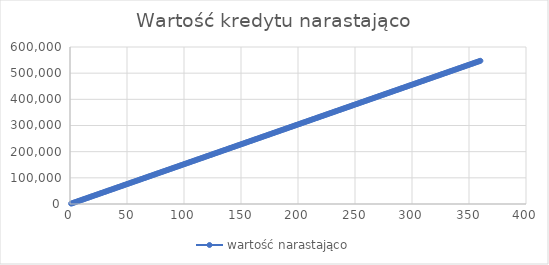
| Category | wartość narastająco |
|---|---|
| 1.0 | 1520.056 |
| 2.0 | 3040.112 |
| 3.0 | 4560.168 |
| 4.0 | 6080.224 |
| 5.0 | 7600.28 |
| 6.0 | 9120.336 |
| 7.0 | 10640.392 |
| 8.0 | 12160.447 |
| 9.0 | 13680.503 |
| 10.0 | 15200.559 |
| 11.0 | 16720.615 |
| 12.0 | 18240.671 |
| 13.0 | 19760.727 |
| 14.0 | 21280.783 |
| 15.0 | 22800.839 |
| 16.0 | 24320.895 |
| 17.0 | 25840.951 |
| 18.0 | 27361.007 |
| 19.0 | 28881.063 |
| 20.0 | 30401.119 |
| 21.0 | 31921.175 |
| 22.0 | 33441.23 |
| 23.0 | 34961.286 |
| 24.0 | 36481.342 |
| 25.0 | 38001.398 |
| 26.0 | 39521.454 |
| 27.0 | 41041.51 |
| 28.0 | 42561.566 |
| 29.0 | 44081.622 |
| 30.0 | 45601.678 |
| 31.0 | 47121.734 |
| 32.0 | 48641.79 |
| 33.0 | 50161.846 |
| 34.0 | 51681.902 |
| 35.0 | 53201.958 |
| 36.0 | 54722.013 |
| 37.0 | 56242.069 |
| 38.0 | 57762.125 |
| 39.0 | 59282.181 |
| 40.0 | 60802.237 |
| 41.0 | 62322.293 |
| 42.0 | 63842.349 |
| 43.0 | 65362.405 |
| 44.0 | 66882.461 |
| 45.0 | 68402.517 |
| 46.0 | 69922.573 |
| 47.0 | 71442.629 |
| 48.0 | 72962.685 |
| 49.0 | 74482.741 |
| 50.0 | 76002.796 |
| 51.0 | 77522.852 |
| 52.0 | 79042.908 |
| 53.0 | 80562.964 |
| 54.0 | 82083.02 |
| 55.0 | 83603.076 |
| 56.0 | 85123.132 |
| 57.0 | 86643.188 |
| 58.0 | 88163.244 |
| 59.0 | 89683.3 |
| 60.0 | 91203.356 |
| 61.0 | 92723.412 |
| 62.0 | 94243.468 |
| 63.0 | 95763.524 |
| 64.0 | 97283.579 |
| 65.0 | 98803.635 |
| 66.0 | 100323.691 |
| 67.0 | 101843.747 |
| 68.0 | 103363.803 |
| 69.0 | 104883.859 |
| 70.0 | 106403.915 |
| 71.0 | 107923.971 |
| 72.0 | 109444.027 |
| 73.0 | 110964.083 |
| 74.0 | 112484.139 |
| 75.0 | 114004.195 |
| 76.0 | 115524.251 |
| 77.0 | 117044.307 |
| 78.0 | 118564.362 |
| 79.0 | 120084.418 |
| 80.0 | 121604.474 |
| 81.0 | 123124.53 |
| 82.0 | 124644.586 |
| 83.0 | 126164.642 |
| 84.0 | 127684.698 |
| 85.0 | 129204.754 |
| 86.0 | 130724.81 |
| 87.0 | 132244.866 |
| 88.0 | 133764.922 |
| 89.0 | 135284.978 |
| 90.0 | 136805.034 |
| 91.0 | 138325.09 |
| 92.0 | 139845.146 |
| 93.0 | 141365.201 |
| 94.0 | 142885.257 |
| 95.0 | 144405.313 |
| 96.0 | 145925.369 |
| 97.0 | 147445.425 |
| 98.0 | 148965.481 |
| 99.0 | 150485.537 |
| 100.0 | 152005.593 |
| 101.0 | 153525.649 |
| 102.0 | 155045.705 |
| 103.0 | 156565.761 |
| 104.0 | 158085.817 |
| 105.0 | 159605.873 |
| 106.0 | 161125.929 |
| 107.0 | 162645.984 |
| 108.0 | 164166.04 |
| 109.0 | 165686.096 |
| 110.0 | 167206.152 |
| 111.0 | 168726.208 |
| 112.0 | 170246.264 |
| 113.0 | 171766.32 |
| 114.0 | 173286.376 |
| 115.0 | 174806.432 |
| 116.0 | 176326.488 |
| 117.0 | 177846.544 |
| 118.0 | 179366.6 |
| 119.0 | 180886.656 |
| 120.0 | 182406.712 |
| 121.0 | 183926.767 |
| 122.0 | 185446.823 |
| 123.0 | 186966.879 |
| 124.0 | 188486.935 |
| 125.0 | 190006.991 |
| 126.0 | 191527.047 |
| 127.0 | 193047.103 |
| 128.0 | 194567.159 |
| 129.0 | 196087.215 |
| 130.0 | 197607.271 |
| 131.0 | 199127.327 |
| 132.0 | 200647.383 |
| 133.0 | 202167.439 |
| 134.0 | 203687.495 |
| 135.0 | 205207.55 |
| 136.0 | 206727.606 |
| 137.0 | 208247.662 |
| 138.0 | 209767.718 |
| 139.0 | 211287.774 |
| 140.0 | 212807.83 |
| 141.0 | 214327.886 |
| 142.0 | 215847.942 |
| 143.0 | 217367.998 |
| 144.0 | 218888.054 |
| 145.0 | 220408.11 |
| 146.0 | 221928.166 |
| 147.0 | 223448.222 |
| 148.0 | 224968.278 |
| 149.0 | 226488.333 |
| 150.0 | 228008.389 |
| 151.0 | 229528.445 |
| 152.0 | 231048.501 |
| 153.0 | 232568.557 |
| 154.0 | 234088.613 |
| 155.0 | 235608.669 |
| 156.0 | 237128.725 |
| 157.0 | 238648.781 |
| 158.0 | 240168.837 |
| 159.0 | 241688.893 |
| 160.0 | 243208.949 |
| 161.0 | 244729.005 |
| 162.0 | 246249.061 |
| 163.0 | 247769.117 |
| 164.0 | 249289.172 |
| 165.0 | 250809.228 |
| 166.0 | 252329.284 |
| 167.0 | 253849.34 |
| 168.0 | 255369.396 |
| 169.0 | 256889.452 |
| 170.0 | 258409.508 |
| 171.0 | 259929.564 |
| 172.0 | 261449.62 |
| 173.0 | 262969.676 |
| 174.0 | 264489.732 |
| 175.0 | 266009.788 |
| 176.0 | 267529.844 |
| 177.0 | 269049.9 |
| 178.0 | 270569.955 |
| 179.0 | 272090.011 |
| 180.0 | 273610.067 |
| 181.0 | 275130.123 |
| 182.0 | 276650.179 |
| 183.0 | 278170.235 |
| 184.0 | 279690.291 |
| 185.0 | 281210.347 |
| 186.0 | 282730.403 |
| 187.0 | 284250.459 |
| 188.0 | 285770.515 |
| 189.0 | 287290.571 |
| 190.0 | 288810.627 |
| 191.0 | 290330.683 |
| 192.0 | 291850.738 |
| 193.0 | 293370.794 |
| 194.0 | 294890.85 |
| 195.0 | 296410.906 |
| 196.0 | 297930.962 |
| 197.0 | 299451.018 |
| 198.0 | 300971.074 |
| 199.0 | 302491.13 |
| 200.0 | 304011.186 |
| 201.0 | 305531.242 |
| 202.0 | 307051.298 |
| 203.0 | 308571.354 |
| 204.0 | 310091.41 |
| 205.0 | 311611.466 |
| 206.0 | 313131.521 |
| 207.0 | 314651.577 |
| 208.0 | 316171.633 |
| 209.0 | 317691.689 |
| 210.0 | 319211.745 |
| 211.0 | 320731.801 |
| 212.0 | 322251.857 |
| 213.0 | 323771.913 |
| 214.0 | 325291.969 |
| 215.0 | 326812.025 |
| 216.0 | 328332.081 |
| 217.0 | 329852.137 |
| 218.0 | 331372.193 |
| 219.0 | 332892.249 |
| 220.0 | 334412.304 |
| 221.0 | 335932.36 |
| 222.0 | 337452.416 |
| 223.0 | 338972.472 |
| 224.0 | 340492.528 |
| 225.0 | 342012.584 |
| 226.0 | 343532.64 |
| 227.0 | 345052.696 |
| 228.0 | 346572.752 |
| 229.0 | 348092.808 |
| 230.0 | 349612.864 |
| 231.0 | 351132.92 |
| 232.0 | 352652.976 |
| 233.0 | 354173.032 |
| 234.0 | 355693.087 |
| 235.0 | 357213.143 |
| 236.0 | 358733.199 |
| 237.0 | 360253.255 |
| 238.0 | 361773.311 |
| 239.0 | 363293.367 |
| 240.0 | 364813.423 |
| 241.0 | 366333.479 |
| 242.0 | 367853.535 |
| 243.0 | 369373.591 |
| 244.0 | 370893.647 |
| 245.0 | 372413.703 |
| 246.0 | 373933.759 |
| 247.0 | 375453.815 |
| 248.0 | 376973.871 |
| 249.0 | 378493.926 |
| 250.0 | 380013.982 |
| 251.0 | 381534.038 |
| 252.0 | 383054.094 |
| 253.0 | 384574.15 |
| 254.0 | 386094.206 |
| 255.0 | 387614.262 |
| 256.0 | 389134.318 |
| 257.0 | 390654.374 |
| 258.0 | 392174.43 |
| 259.0 | 393694.486 |
| 260.0 | 395214.542 |
| 261.0 | 396734.598 |
| 262.0 | 398254.654 |
| 263.0 | 399774.709 |
| 264.0 | 401294.765 |
| 265.0 | 402814.821 |
| 266.0 | 404334.877 |
| 267.0 | 405854.933 |
| 268.0 | 407374.989 |
| 269.0 | 408895.045 |
| 270.0 | 410415.101 |
| 271.0 | 411935.157 |
| 272.0 | 413455.213 |
| 273.0 | 414975.269 |
| 274.0 | 416495.325 |
| 275.0 | 418015.381 |
| 276.0 | 419535.437 |
| 277.0 | 421055.492 |
| 278.0 | 422575.548 |
| 279.0 | 424095.604 |
| 280.0 | 425615.66 |
| 281.0 | 427135.716 |
| 282.0 | 428655.772 |
| 283.0 | 430175.828 |
| 284.0 | 431695.884 |
| 285.0 | 433215.94 |
| 286.0 | 434735.996 |
| 287.0 | 436256.052 |
| 288.0 | 437776.108 |
| 289.0 | 439296.164 |
| 290.0 | 440816.22 |
| 291.0 | 442336.275 |
| 292.0 | 443856.331 |
| 293.0 | 445376.387 |
| 294.0 | 446896.443 |
| 295.0 | 448416.499 |
| 296.0 | 449936.555 |
| 297.0 | 451456.611 |
| 298.0 | 452976.667 |
| 299.0 | 454496.723 |
| 300.0 | 456016.779 |
| 301.0 | 457536.835 |
| 302.0 | 459056.891 |
| 303.0 | 460576.947 |
| 304.0 | 462097.003 |
| 305.0 | 463617.058 |
| 306.0 | 465137.114 |
| 307.0 | 466657.17 |
| 308.0 | 468177.226 |
| 309.0 | 469697.282 |
| 310.0 | 471217.338 |
| 311.0 | 472737.394 |
| 312.0 | 474257.45 |
| 313.0 | 475777.506 |
| 314.0 | 477297.562 |
| 315.0 | 478817.618 |
| 316.0 | 480337.674 |
| 317.0 | 481857.73 |
| 318.0 | 483377.786 |
| 319.0 | 484897.842 |
| 320.0 | 486417.897 |
| 321.0 | 487937.953 |
| 322.0 | 489458.009 |
| 323.0 | 490978.065 |
| 324.0 | 492498.121 |
| 325.0 | 494018.177 |
| 326.0 | 495538.233 |
| 327.0 | 497058.289 |
| 328.0 | 498578.345 |
| 329.0 | 500098.401 |
| 330.0 | 501618.457 |
| 331.0 | 503138.513 |
| 332.0 | 504658.569 |
| 333.0 | 506178.625 |
| 334.0 | 507698.68 |
| 335.0 | 509218.736 |
| 336.0 | 510738.792 |
| 337.0 | 512258.848 |
| 338.0 | 513778.904 |
| 339.0 | 515298.96 |
| 340.0 | 516819.016 |
| 341.0 | 518339.072 |
| 342.0 | 519859.128 |
| 343.0 | 521379.184 |
| 344.0 | 522899.24 |
| 345.0 | 524419.296 |
| 346.0 | 525939.352 |
| 347.0 | 527459.408 |
| 348.0 | 528979.463 |
| 349.0 | 530499.519 |
| 350.0 | 532019.575 |
| 351.0 | 533539.631 |
| 352.0 | 535059.687 |
| 353.0 | 536579.743 |
| 354.0 | 538099.799 |
| 355.0 | 539619.855 |
| 356.0 | 541139.911 |
| 357.0 | 542659.967 |
| 358.0 | 544180.023 |
| 359.0 | 545700.079 |
| 360.0 | 547220.135 |